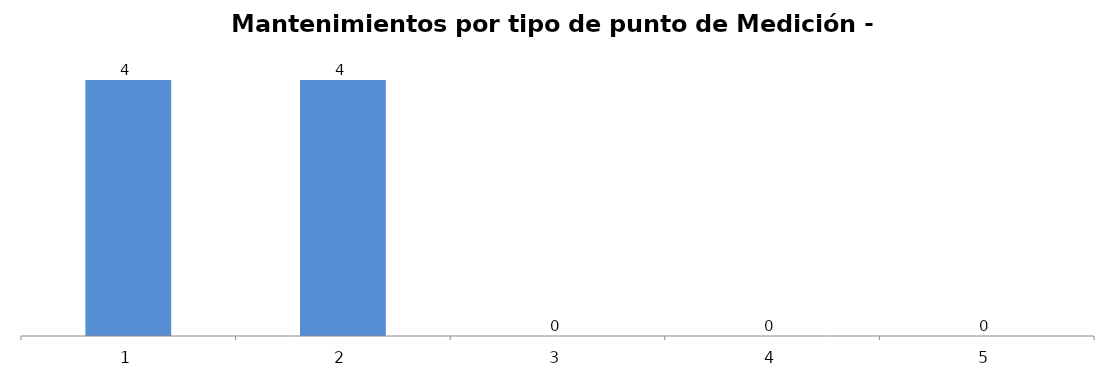
| Category | Mantenimientos por tipo de punto de Medición - Acumulado Año |
|---|---|
| 0 | 4 |
| 1 | 4 |
| 2 | 0 |
| 3 | 0 |
| 4 | 0 |